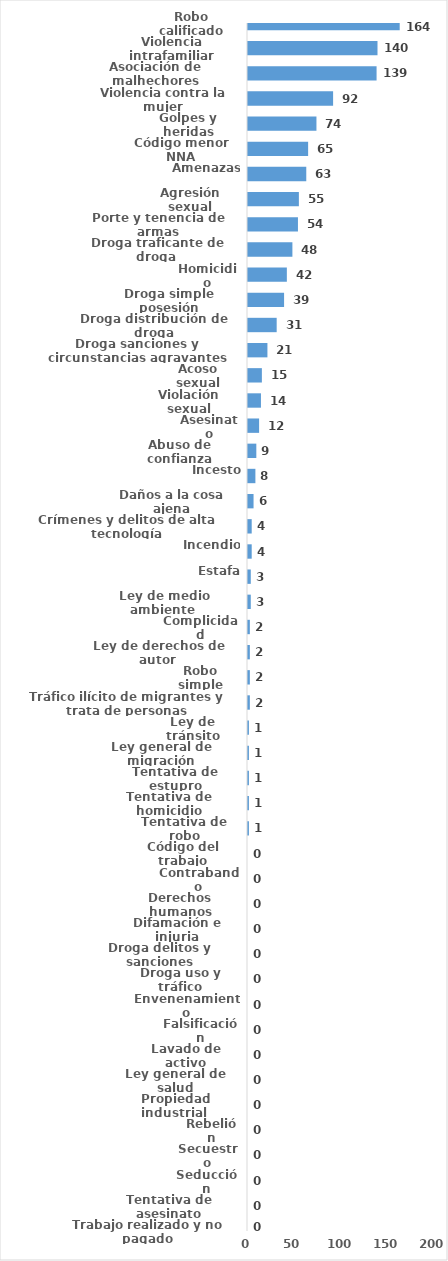
| Category | Series 0 |
|---|---|
| Robo calificado | 164 |
| Violencia intrafamiliar | 140 |
| Asociación de malhechores | 139 |
| Violencia contra la mujer | 92 |
| Golpes y heridas | 74 |
| Código menor NNA | 65 |
| Amenazas | 63 |
| Agresión sexual | 55 |
| Porte y tenencia de armas | 54 |
| Droga traficante de droga  | 48 |
| Homicidio | 42 |
| Droga simple posesión | 39 |
| Droga distribución de droga | 31 |
| Droga sanciones y circunstancias agravantes | 21 |
| Acoso sexual | 15 |
| Violación sexual | 14 |
| Asesinato | 12 |
| Abuso de confianza | 9 |
| Incesto | 8 |
| Daños a la cosa ajena | 6 |
| Crímenes y delitos de alta tecnología | 4 |
| Incendio | 4 |
| Estafa | 3 |
| Ley de medio ambiente  | 3 |
| Complicidad | 2 |
| Ley de derechos de autor  | 2 |
| Robo simple | 2 |
| Tráfico ilícito de migrantes y trata de personas | 2 |
| Ley de tránsito | 1 |
| Ley general de migración | 1 |
| Tentativa de estupro | 1 |
| Tentativa de homicidio | 1 |
| Tentativa de robo | 1 |
| Código del trabajo | 0 |
| Contrabando | 0 |
| Derechos humanos | 0 |
| Difamación e injuria | 0 |
| Droga delitos y sanciones | 0 |
| Droga uso y tráfico | 0 |
| Envenenamiento | 0 |
| Falsificación | 0 |
| Lavado de activo | 0 |
| Ley general de salud | 0 |
| Propiedad industrial  | 0 |
| Rebelión | 0 |
| Secuestro | 0 |
| Seducción | 0 |
| Tentativa de asesinato | 0 |
| Trabajo realizado y no pagado | 0 |